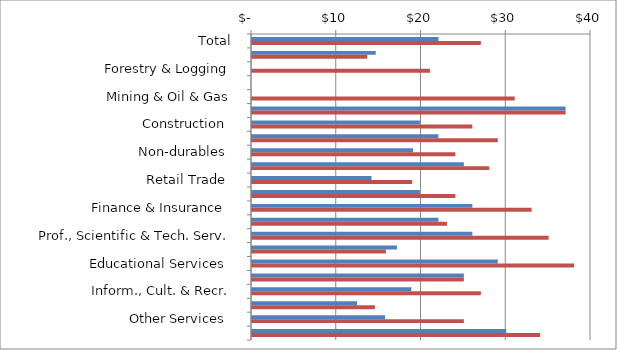
| Category | Series 0 | Series 1 |
|---|---|---|
| Total | 22 | 27 |
|  Agriculture   | 14.6 | 13.6 |
|  Forestry & Logging  | 0 | 21 |
|  Fishing, Hunting & Trapping   | 0 | 0 |
|  Mining & Oil & Gas  | 0 | 31 |
|  Utilities   | 37 | 37 |
|  Construction   | 19.8 | 26 |
|  Durables   | 22 | 29 |
|  Non-durables   | 19 | 24 |
|  Wholesale Trade   | 25 | 28 |
|  Retail Trade   | 14.1 | 18.9 |
|  Transportation & Warehousing   | 19.8 | 24 |
|  Finance & Insurance   | 26 | 33 |
|  Real Estate & Leasing   | 22 | 23 |
|  Prof., Scientific & Tech. Serv.  | 26 | 35 |
|  Bus., building & support serv.  | 17.1 | 15.8 |
|  Educational Services   | 29 | 38 |
|  Health Care & Social Assistance   | 25 | 25 |
|  Inform., Cult. & Recr.  | 18.8 | 27 |
|  Accomm. & Food Services   | 12.4 | 14.5 |
|  Other Services   | 15.7 | 25 |
|  Public Administration   | 30 | 34 |